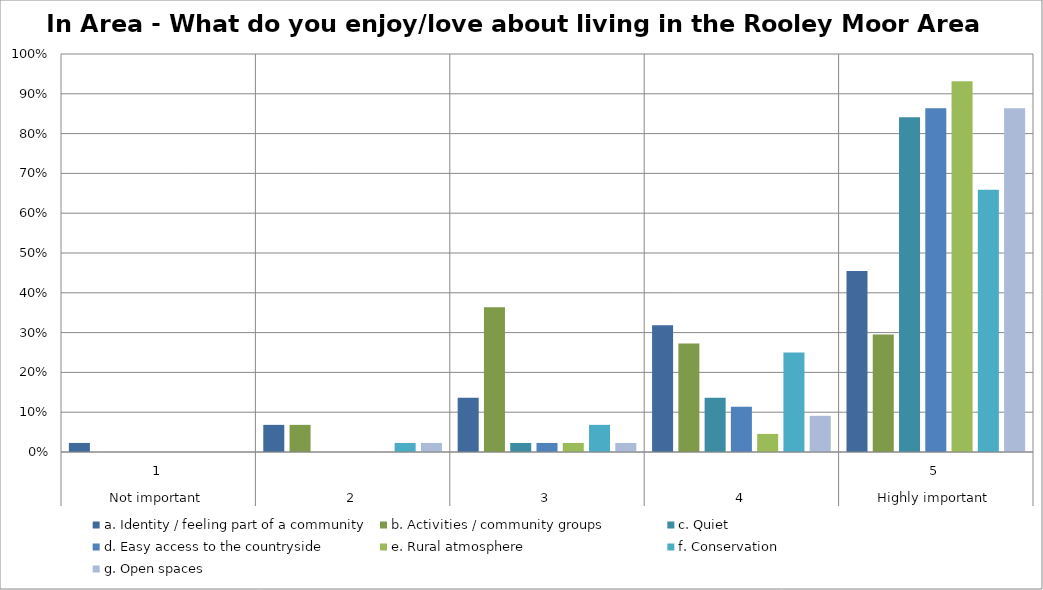
| Category | a. Identity / feeling part of a community | b. Activities / community groups | c. Quiet | d. Easy access to the countryside | e. Rural atmosphere | f. Conservation | g. Open spaces |
|---|---|---|---|---|---|---|---|
| 0 | 0.023 | 0 | 0 | 0 | 0 | 0 | 0 |
| 1 | 0.068 | 0.068 | 0 | 0 | 0 | 0.023 | 0.023 |
| 2 | 0.136 | 0.364 | 0.023 | 0.023 | 0.023 | 0.068 | 0.023 |
| 3 | 0.318 | 0.273 | 0.136 | 0.114 | 0.045 | 0.25 | 0.091 |
| 4 | 0.455 | 0.295 | 0.841 | 0.864 | 0.932 | 0.659 | 0.864 |